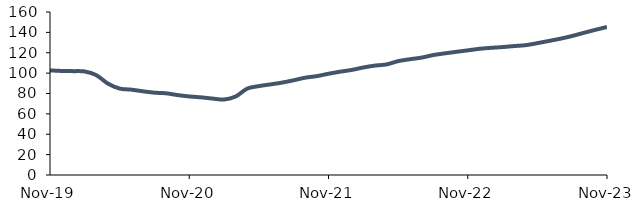
| Category | Series 0 |
|---|---|
| 2019-11-01 | 102.703 |
| 2019-12-01 | 102.142 |
| 2020-01-01 | 101.951 |
| 2020-02-01 | 101.62 |
| 2020-03-01 | 97.938 |
| 2020-04-01 | 89.65 |
| 2020-05-01 | 84.839 |
| 2020-06-01 | 83.781 |
| 2020-07-01 | 82.182 |
| 2020-08-01 | 80.808 |
| 2020-09-01 | 80.198 |
| 2020-10-01 | 78.439 |
| 2020-11-01 | 77.102 |
| 2020-12-01 | 76.237 |
| 2021-01-01 | 75.045 |
| 2021-02-01 | 74.096 |
| 2021-03-01 | 77.079 |
| 2021-04-01 | 84.788 |
| 2021-05-01 | 87.267 |
| 2021-06-01 | 88.947 |
| 2021-07-01 | 90.706 |
| 2021-08-01 | 93 |
| 2021-09-01 | 95.533 |
| 2021-10-01 | 97.064 |
| 2021-11-01 | 99.379 |
| 2021-12-01 | 101.416 |
| 2022-01-01 | 103.119 |
| 2022-02-01 | 105.529 |
| 2022-03-01 | 107.371 |
| 2022-04-01 | 108.553 |
| 2022-05-01 | 111.761 |
| 2022-06-01 | 113.626 |
| 2022-07-01 | 115.177 |
| 2022-08-01 | 117.668 |
| 2022-09-01 | 119.358 |
| 2022-10-01 | 120.89 |
| 2022-11-01 | 122.346 |
| 2022-12-01 | 123.861 |
| 2023-01-01 | 124.823 |
| 2023-02-01 | 125.58 |
| 2023-03-01 | 126.574 |
| 2023-04-01 | 127.453 |
| 2023-05-01 | 129.424 |
| 2023-06-01 | 131.612 |
| 2023-07-01 | 133.833 |
| 2023-08-01 | 136.462 |
| 2023-09-01 | 139.531 |
| 2023-10-01 | 142.523 |
| 2023-11-01 | 145.297 |